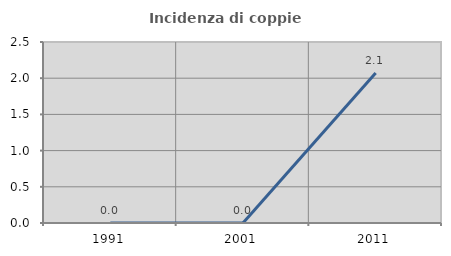
| Category | Incidenza di coppie miste |
|---|---|
| 1991.0 | 0 |
| 2001.0 | 0 |
| 2011.0 | 2.073 |